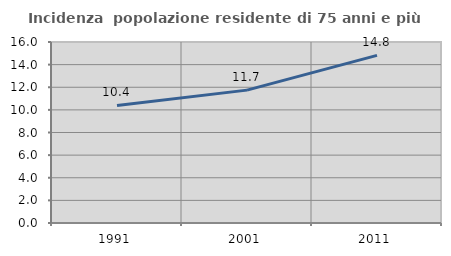
| Category | Incidenza  popolazione residente di 75 anni e più |
|---|---|
| 1991.0 | 10.392 |
| 2001.0 | 11.746 |
| 2011.0 | 14.815 |